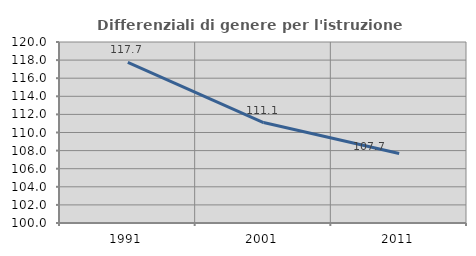
| Category | Differenziali di genere per l'istruzione superiore |
|---|---|
| 1991.0 | 117.745 |
| 2001.0 | 111.099 |
| 2011.0 | 107.68 |